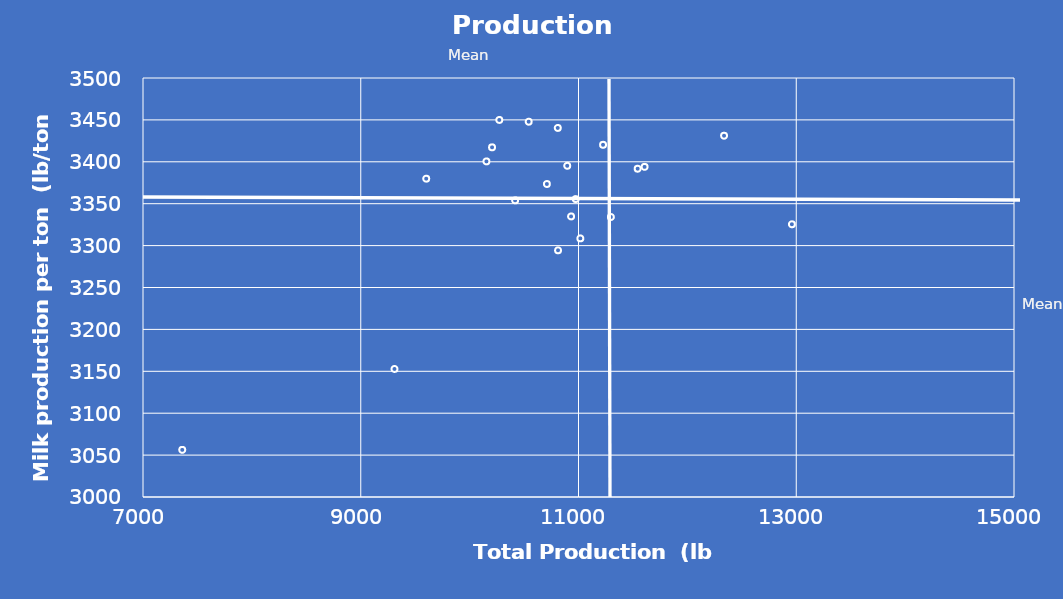
| Category | Series 0 |
|---|---|
| 7360.458631719 | 3056.24 |
| 11297.641637353 | 3334.115 |
| 10542.202554017 | 3447.845 |
| 10809.491399138 | 3440.398 |
| 9309.748993142 | 3152.811 |
| 10417.816683537 | 3353.992 |
| 10812.121191315 | 3294.373 |
| 11225.680092829 | 3420.303 |
| 10709.381808823 | 3373.522 |
| 12959.98770275 | 3325.435 |
| 10896.366313869 | 3395.237 |
| 10272.370354645 | 3449.963 |
| 11543.530796758 | 3391.752 |
| 9601.345508049 | 3379.859 |
| 10154.093394415 | 3400.484 |
| 10975.245434974 | 3355.519 |
| 10931.652476152 | 3334.804 |
| 10205.931277197 | 3417.273 |
| 11016.952402066 | 3308.629 |
| 12336.910523395 | 3431.112 |
| 11607.025281435 | 3393.949 |